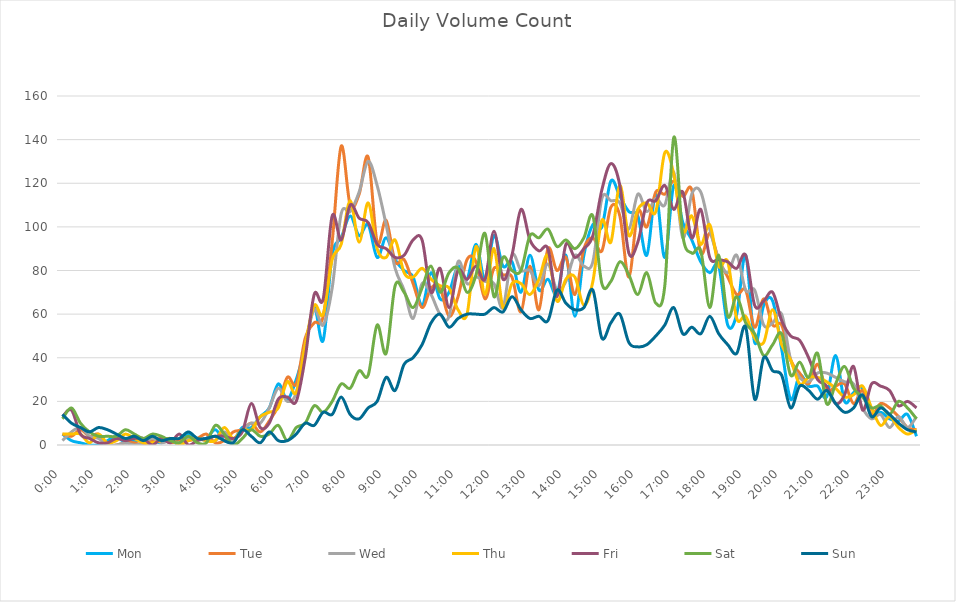
| Category | Mon | Tue | Wed | Thu | Fri | Sat | Sun |
|---|---|---|---|---|---|---|---|
| 0.0 | 5 | 5 | 2 | 5 | 13 | 12 | 14 |
| 0.010416666666666666 | 2 | 4 | 6 | 5 | 16 | 17 | 10 |
| 0.020833333333333332 | 1 | 7 | 8 | 5 | 5 | 10 | 8 |
| 0.03125 | 0 | 4 | 4 | 1 | 3 | 6 | 6 |
| 0.041666666666666664 | 0 | 5 | 3 | 5 | 1 | 4 | 8 |
| 0.05208333333333333 | 2 | 0 | 0 | 1 | 1 | 4 | 7 |
| 0.06249999999999999 | 4 | 0 | 0 | 2 | 3 | 4 | 5 |
| 0.07291666666666666 | 1 | 1 | 1 | 5 | 2 | 7 | 3 |
| 0.08333333333333333 | 2 | 1 | 0 | 3 | 3 | 5 | 4 |
| 0.09375 | 2 | 0 | 1 | 1 | 3 | 3 | 2 |
| 0.10416666666666667 | 2 | 2 | 3 | 1 | 0 | 5 | 4 |
| 0.11458333333333334 | 1 | 3 | 1 | 2 | 3 | 4 | 2 |
| 0.125 | 3 | 1 | 2 | 3 | 1 | 2 | 3 |
| 0.13541666666666666 | 0 | 2 | 1 | 0 | 5 | 1 | 3 |
| 0.14583333333333331 | 5 | 2 | 3 | 2 | 0 | 4 | 6 |
| 0.15624999999999997 | 3 | 3 | 3 | 3 | 2 | 1 | 3 |
| 0.16666666666666663 | 3 | 5 | 2 | 2 | 3 | 1 | 3 |
| 0.1770833333333333 | 7 | 1 | 2 | 2 | 4 | 9 | 4 |
| 0.18749999999999994 | 2 | 2 | 6 | 8 | 4 | 5 | 2 |
| 0.1979166666666666 | 2 | 6 | 2 | 3 | 3 | 0 | 1 |
| 0.20833333333333326 | 8 | 7 | 7 | 7 | 6 | 3 | 7 |
| 0.21874999999999992 | 8 | 10 | 10 | 7 | 19 | 7 | 4 |
| 0.22916666666666657 | 13 | 6 | 10 | 13 | 8 | 4 | 1 |
| 0.23958333333333323 | 17 | 11 | 17 | 15 | 10 | 5 | 6 |
| 0.2499999999999999 | 28 | 18 | 26 | 17 | 21 | 9 | 2 |
| 0.2604166666666666 | 21 | 31 | 20 | 29 | 22 | 2 | 2 |
| 0.27083333333333326 | 30 | 28 | 24 | 24 | 20 | 8 | 5 |
| 0.28124999999999994 | 45 | 49 | 46 | 46 | 40 | 10 | 10 |
| 0.29166666666666663 | 63 | 56 | 62 | 64 | 69 | 18 | 9 |
| 0.3020833333333333 | 48 | 59 | 55 | 60 | 67 | 15 | 15 |
| 0.3125 | 87 | 93 | 72 | 85 | 105 | 20 | 14 |
| 0.3229166666666667 | 95 | 137 | 106 | 92 | 94 | 28 | 22 |
| 0.33333333333333337 | 105 | 110 | 107 | 112 | 110 | 26 | 14 |
| 0.34375000000000006 | 96 | 115 | 116 | 93 | 104 | 34 | 12 |
| 0.35416666666666674 | 101 | 132 | 130 | 111 | 102 | 32 | 17 |
| 0.3645833333333334 | 86 | 93 | 119 | 90 | 92 | 55 | 20 |
| 0.3750000000000001 | 95 | 103 | 101 | 86 | 90 | 42 | 31 |
| 0.3854166666666668 | 85 | 84 | 81 | 94 | 86 | 73 | 25 |
| 0.3958333333333335 | 80 | 85 | 71 | 79 | 87 | 70 | 37 |
| 0.40625000000000017 | 77 | 74 | 58 | 77 | 94 | 63 | 40 |
| 0.41666666666666685 | 64 | 63 | 74 | 81 | 94 | 72 | 46 |
| 0.4270833333333333 | 79 | 72 | 69 | 76 | 70 | 82 | 56 |
| 0.4375000000000002 | 67 | 72 | 60 | 73 | 81 | 70 | 60 |
| 0.4479166666666669 | 70 | 59 | 59 | 72 | 63 | 79 | 54 |
| 0.4583333333333333 | 82 | 68 | 84 | 62 | 80 | 81 | 58 |
| 0.4687500000000003 | 76 | 85 | 74 | 60 | 76 | 70 | 60 |
| 0.47916666666666696 | 92 | 84 | 77 | 91 | 82 | 78 | 60 |
| 0.4895833333333333 | 76 | 67 | 75 | 69 | 76 | 97 | 60 |
| 0.5000000000000003 | 96 | 81 | 74 | 90 | 98 | 68 | 63 |
| 0.510416666666667 | 82 | 78 | 63 | 63 | 76 | 86 | 61 |
| 0.5208333333333334 | 84 | 77 | 87 | 74 | 87 | 80 | 68 |
| 0.5312500000000002 | 70 | 61 | 80 | 74 | 108 | 80 | 62 |
| 0.5416666666666669 | 87 | 82 | 80 | 69 | 94 | 96 | 58 |
| 0.5520833333333335 | 71 | 62 | 73 | 76 | 89 | 95 | 59 |
| 0.5625000000000001 | 76 | 90 | 83 | 87 | 90 | 99 | 57 |
| 0.5729166666666667 | 69 | 80 | 71 | 66 | 68 | 91 | 71 |
| 0.5833333333333334 | 87 | 86 | 75 | 76 | 92 | 94 | 65 |
| 0.59375 | 59 | 69 | 87 | 77 | 86 | 90 | 62 |
| 0.6041666666666666 | 87 | 90 | 82 | 64 | 90 | 95 | 63 |
| 0.6145833333333333 | 101 | 95 | 84 | 75 | 96 | 105 | 71 |
| 0.6249999999999999 | 100 | 89 | 113 | 103 | 117 | 74 | 49 |
| 0.6354166666666665 | 121 | 109 | 112 | 93 | 129 | 75 | 56 |
| 0.6458333333333331 | 114 | 105 | 111 | 119 | 119 | 84 | 60 |
| 0.6562499999999998 | 107 | 77 | 99 | 96 | 88 | 78 | 47 |
| 0.6666666666666666 | 105 | 107 | 115 | 108 | 93 | 69 | 45 |
| 0.677083333333333 | 87 | 100 | 107 | 111 | 111 | 79 | 46 |
| 0.6874999999999997 | 115 | 116 | 113 | 107 | 112 | 65 | 50 |
| 0.6979166666666666 | 86 | 115 | 110 | 134 | 119 | 73 | 55 |
| 0.7083333333333329 | 119 | 121 | 125 | 124 | 108 | 141 | 63 |
| 0.7187499999999996 | 102 | 114 | 95 | 98 | 116 | 96 | 51 |
| 0.7291666666666666 | 94 | 117 | 115 | 105 | 95 | 88 | 54 |
| 0.7395833333333328 | 84 | 88 | 116 | 92 | 108 | 89 | 51 |
| 0.75 | 79 | 97 | 99 | 101 | 86 | 63 | 59 |
| 0.7604166666666666 | 82 | 85 | 85 | 82 | 85 | 87 | 51 |
| 0.7708333333333327 | 55 | 77 | 79 | 84 | 84 | 59 | 46 |
| 0.78125 | 60 | 69 | 87 | 58 | 81 | 68 | 42 |
| 0.7916666666666666 | 87 | 71 | 71 | 59 | 87 | 56 | 54 |
| 0.8020833333333326 | 47 | 54 | 71 | 49 | 64 | 51 | 21 |
| 0.8125 | 64 | 67 | 55 | 47 | 66 | 41 | 40 |
| 0.8229166666666666 | 66 | 55 | 56 | 62 | 70 | 46 | 34 |
| 0.8333333333333334 | 44 | 55 | 60 | 46 | 57 | 51 | 32 |
| 0.84375 | 21 | 39 | 39 | 39 | 50 | 32 | 17 |
| 0.8541666666666666 | 32 | 33 | 31 | 28 | 48 | 38 | 27 |
| 0.8645833333333334 | 27 | 28 | 29 | 31 | 40 | 31 | 25 |
| 0.875 | 27 | 37 | 33 | 31 | 30 | 42 | 21 |
| 0.8854166666666666 | 22 | 25 | 33 | 29 | 27 | 19 | 25 |
| 0.8958333333333334 | 41 | 27 | 31 | 26 | 19 | 28 | 19 |
| 0.90625 | 20 | 28 | 29 | 22 | 23 | 36 | 15 |
| 0.9166666666666666 | 24 | 19 | 28 | 23 | 36 | 26 | 17 |
| 0.9270833333333334 | 26 | 25 | 17 | 27 | 16 | 22 | 23 |
| 0.9375 | 13 | 14 | 12 | 17 | 28 | 17 | 13 |
| 0.9479166666666666 | 15 | 19 | 14 | 9 | 27 | 18 | 17 |
| 0.9583333333333334 | 12 | 17 | 8 | 13 | 25 | 14 | 14 |
| 0.96875 | 11 | 13 | 13 | 8 | 18 | 20 | 10 |
| 0.9791666666666666 | 14 | 8 | 8 | 5 | 20 | 17 | 7 |
| 0.9895833333333334 | 4 | 7 | 13 | 7 | 17 | 12 | 6 |